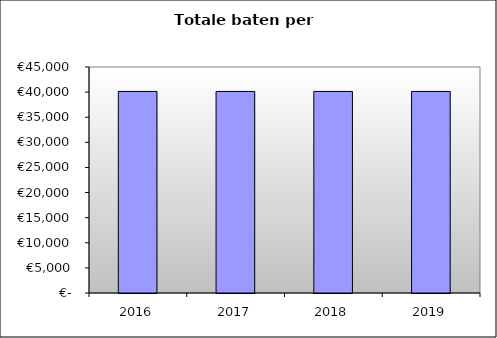
| Category | Series 0 |
|---|---|
| 2016.0 | 40128.949 |
| 2017.0 | 40128.949 |
| 2018.0 | 40128.949 |
| 2019.0 | 40128.949 |